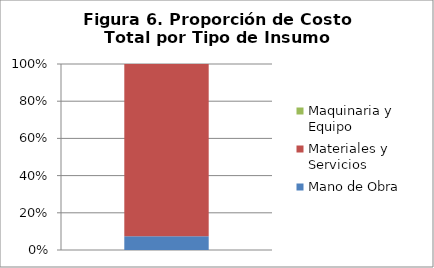
| Category | Mano de Obra | Materiales y Servicios | Maquinaria y Equipo |
|---|---|---|---|
| 0 | 687000 | 8674600 | 0 |